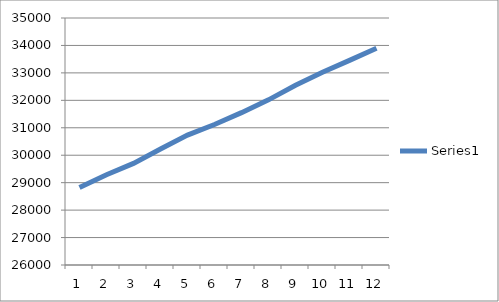
| Category | Series 0 |
|---|---|
| 0 | 28823.3 |
| 1 | 29291.7 |
| 2 | 29702.6 |
| 3 | 30227.5 |
| 4 | 30731.6 |
| 5 | 31120 |
| 6 | 31551.7 |
| 7 | 32018.3 |
| 8 | 32547.2 |
| 9 | 33022.9 |
| 10 | 33457.1 |
| 11 | 33897.9 |